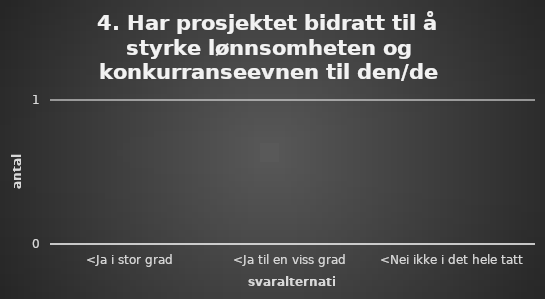
| Category | Series 0 |
|---|---|
| <Ja i stor grad | 0 |
| <Ja til en viss grad | 0 |
| <Nei ikke i det hele tatt | 0 |